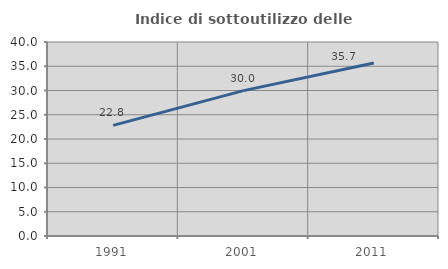
| Category | Indice di sottoutilizzo delle abitazioni  |
|---|---|
| 1991.0 | 22.807 |
| 2001.0 | 29.977 |
| 2011.0 | 35.669 |